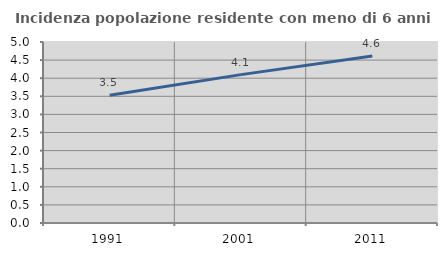
| Category | Incidenza popolazione residente con meno di 6 anni |
|---|---|
| 1991.0 | 3.526 |
| 2001.0 | 4.099 |
| 2011.0 | 4.614 |